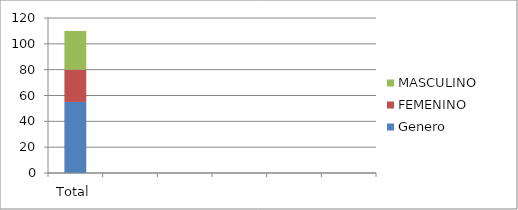
| Category | Genero | FEMENINO | MASCULINO |
|---|---|---|---|
| Total | 55 | 25 | 30 |